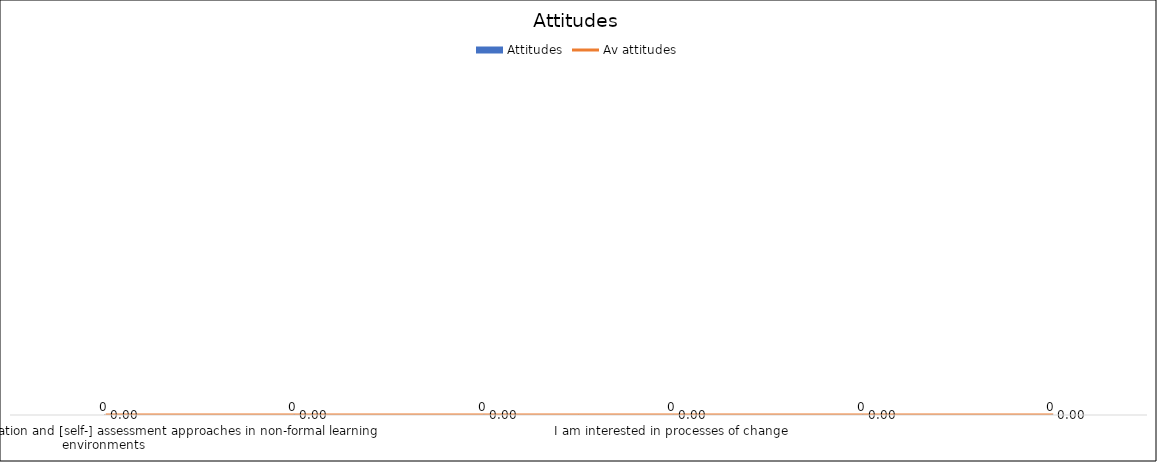
| Category | Attitudes |
|---|---|
| I am open to different evaluation and [self-] assessment approaches in non-formal learning environments  | 0 |
| I am ready to learn about evaluation and assessment  | 0 |
| I am ready to be challenged and challenge others with regard to transformation | 0 |
| I am interested in processes of change | 0 |
| I am ready to present and share the outcomes of a programme/project with a wider audience | 0 |
| I am aware of the fact that no information/data is 100% reliable (with regard to its collection and use) | 0 |